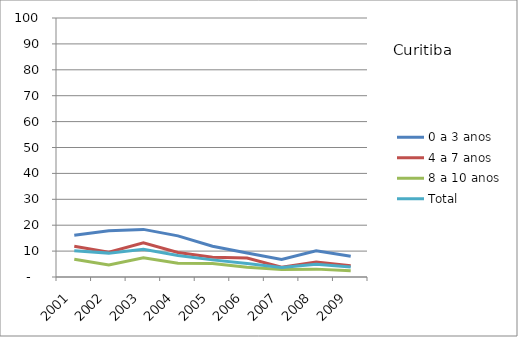
| Category | 0 a 3 anos | 4 a 7 anos | 8 a 10 anos | Total |
|---|---|---|---|---|
| 2001.0 | 16.16 | 11.89 | 6.89 | 10.09 |
| 2002.0 | 17.82 | 9.54 | 4.62 | 9.22 |
| 2003.0 | 18.38 | 13.19 | 7.42 | 10.72 |
| 2004.0 | 15.88 | 9.45 | 5.32 | 8.29 |
| 2005.0 | 11.86 | 7.62 | 5.2 | 6.61 |
| 2006.0 | 9.27 | 7.35 | 3.76 | 5.18 |
| 2007.0 | 6.79 | 3.81 | 2.93 | 3.63 |
| 2008.0 | 10.12 | 5.79 | 3.04 | 4.92 |
| 2009.0 | 8.01 | 4.38 | 2.45 | 3.9 |